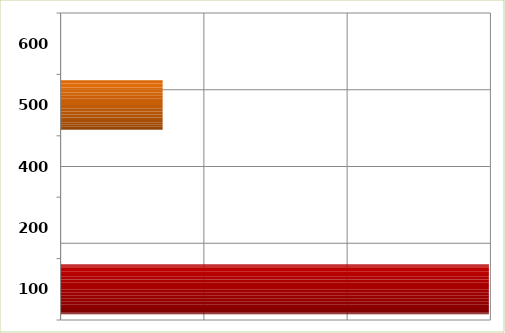
| Category | Series 0 |
|---|---|
| 100.0 | 298937988.24 |
| 200.0 | 0 |
| 400.0 | 0 |
| 500.0 | 71220145 |
| 600.0 | 0 |